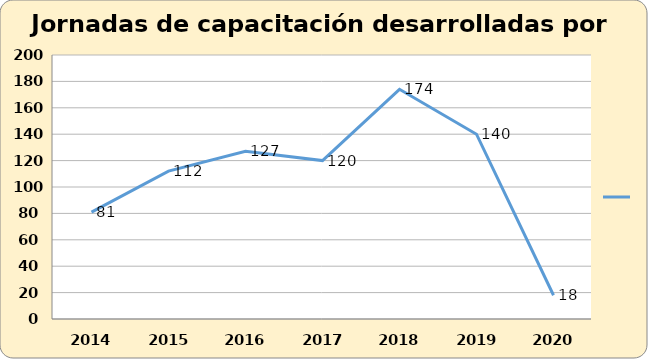
| Category | Series 0 |
|---|---|
| 2014.0 | 81 |
| 2015.0 | 112 |
| 2016.0 | 127 |
| 2017.0 | 120 |
| 2018.0 | 174 |
| 2019.0 | 140 |
| 2020.0 | 18 |